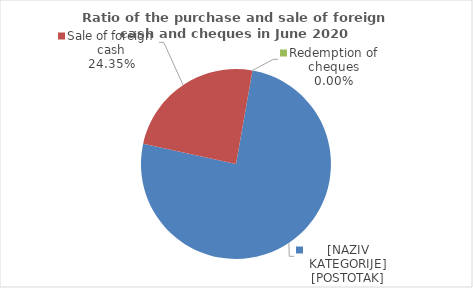
| Category | Series 0 |
|---|---|
| Purchase of foreign cash | 75.654 |
| Sale of foreign cash | 24.346 |
| Redemption of cheques | 0 |